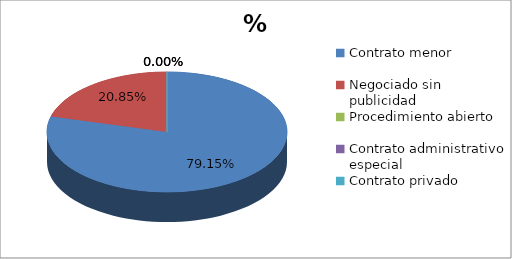
| Category | % volumen |
|---|---|
| Contrato menor | 0.792 |
| Negociado sin publicidad | 0.208 |
| Procedimiento abierto | 0 |
| Contrato administrativo especial | 0 |
| Contrato privado | 0 |